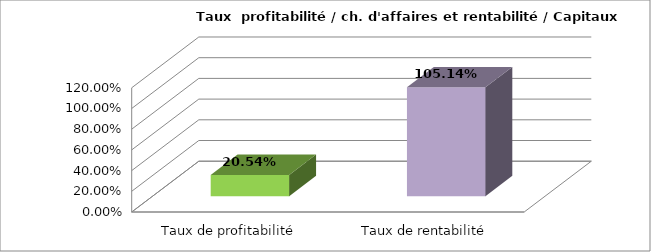
| Category | Series 0 |
|---|---|
| Taux de profitabilité | 0.205 |
| Taux de rentabilité | 1.051 |